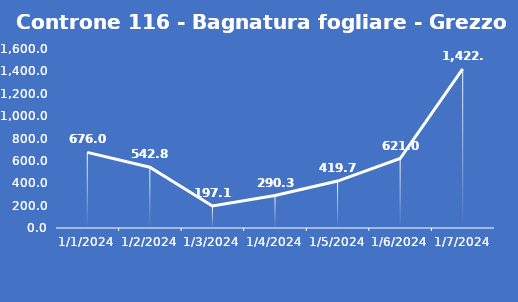
| Category | Controne 116 - Bagnatura fogliare - Grezzo (min) |
|---|---|
| 1/1/24 | 676 |
| 1/2/24 | 542.8 |
| 1/3/24 | 197.1 |
| 1/4/24 | 290.3 |
| 1/5/24 | 419.7 |
| 1/6/24 | 621 |
| 1/7/24 | 1422.2 |